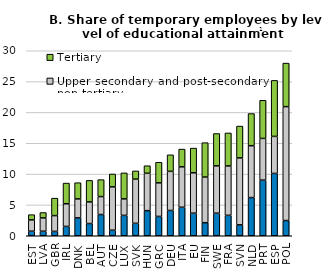
| Category | Less than upper secondary | Upper secondary and post-secondary non-tertiary | Tertiary |
|---|---|---|---|
| EST | 0.738 | 1.836 | 0.846 |
| LVA | 0.737 | 2.159 | 0.869 |
| GBR | 0.708 | 2.559 | 2.835 |
| IRL | 1.517 | 3.674 | 3.351 |
| DNK | 2.899 | 3.08 | 2.623 |
| BEL | 1.984 | 3.505 | 3.492 |
| AUT | 3.443 | 2.912 | 2.745 |
| CZE | 0.9 | 7.029 | 2.082 |
| LUX | 3.308 | 2.673 | 4.214 |
| SVK | 2.016 | 7.169 | 1.326 |
| HUN | 4.071 | 6.062 | 1.222 |
| GRC | 3.136 | 5.446 | 3.341 |
| DEU | 4.1 | 6.342 | 2.684 |
| ITA | 4.62 | 6.556 | 2.877 |
| EU | 3.66 | 6.553 | 4 |
| FIN | 2.12 | 7.395 | 5.58 |
| SWE | 3.658 | 7.676 | 5.246 |
| FRA | 3.313 | 8.009 | 5.348 |
| SVN | 1.768 | 10.858 | 5.16 |
| NLD | 6.192 | 8.412 | 5.21 |
| PRT | 9.02 | 6.763 | 6.182 |
| ESP | 10.11 | 6.004 | 9.083 |
| POL | 2.467 | 18.474 | 7.057 |